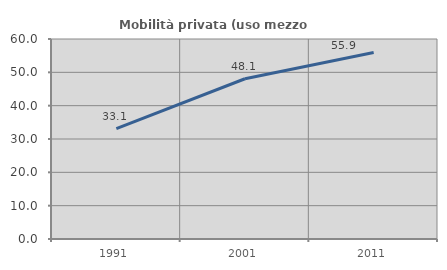
| Category | Mobilità privata (uso mezzo privato) |
|---|---|
| 1991.0 | 33.121 |
| 2001.0 | 48.08 |
| 2011.0 | 55.935 |